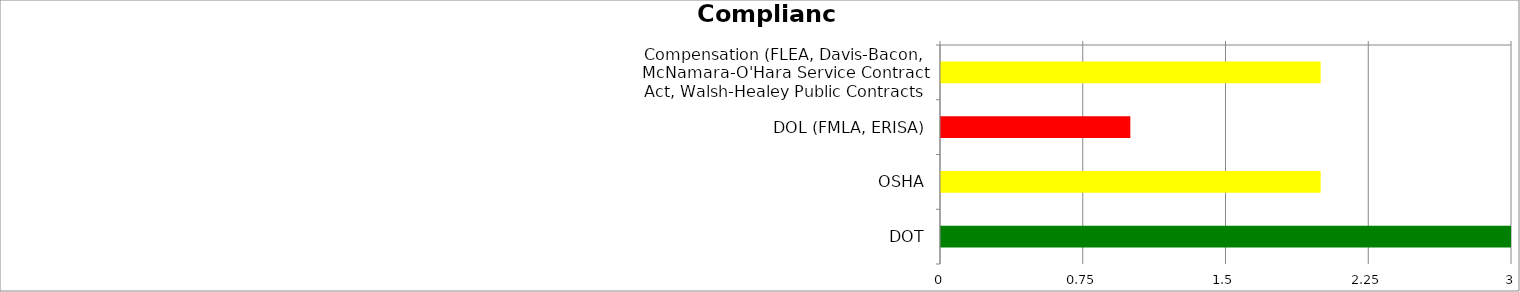
| Category | Low | Medium | High |
|---|---|---|---|
| Compensation (FLEA, Davis-Bacon, McNamara-O'Hara Service Contract Act, Walsh-Healey Public Contracts Act, Copeland Act). | 0 | 2 | 0 |
| DOL (FMLA, ERISA) | 0 | 0 | 1 |
| OSHA | 0 | 2 | 0 |
| DOT | 3 | 0 | 0 |